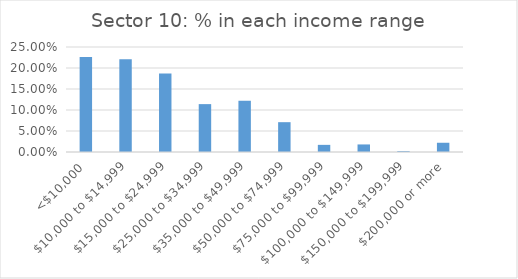
| Category | Series 0 |
|---|---|
| <$10,000 | 0.226 |
| $10,000 to $14,999 | 0.221 |
| $15,000 to $24,999 | 0.187 |
| $25,000 to $34,999 | 0.114 |
| $35,000 to $49,999 | 0.122 |
| $50,000 to $74,999 | 0.071 |
| $75,000 to $99,999 | 0.017 |
| $100,000 to $149,999 | 0.018 |
| $150,000 to $199,999 | 0.002 |
| $200,000 or more | 0.022 |